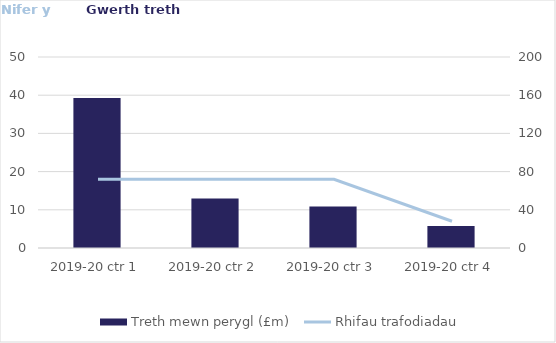
| Category | Treth mewn perygl (£m) |
|---|---|
| 2019-20 ctr 1 | 157108.42 |
| 2019-20 ctr 2 | 51891.01 |
| 2019-20 ctr 3 | 43434.44 |
| 2019-20 ctr 4 | 22998.61 |